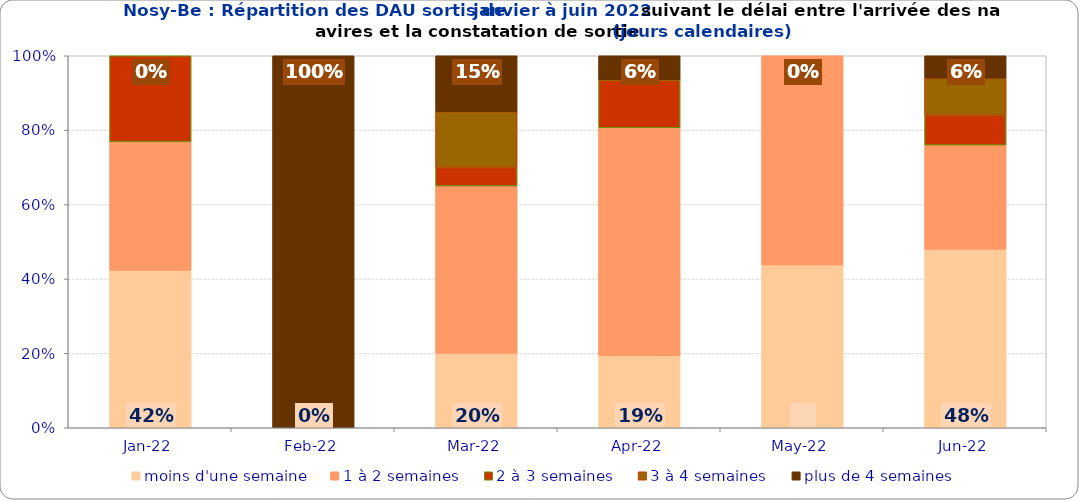
| Category | moins d'une semaine | 1 à 2 semaines | 2 à 3 semaines | 3 à 4 semaines | plus de 4 semaines |
|---|---|---|---|---|---|
| 2022-01-01 | 0.423 | 0.346 | 0.231 | 0 | 0 |
| 2022-02-01 | 0 | 0 | 0 | 0 | 1 |
| 2022-03-01 | 0.2 | 0.45 | 0.05 | 0.15 | 0.15 |
| 2022-04-01 | 0.194 | 0.613 | 0.129 | 0 | 0.065 |
| 2022-05-01 | 0.438 | 0.562 | 0 | 0 | 0 |
| 2022-06-01 | 0.48 | 0.28 | 0.08 | 0.1 | 0.06 |